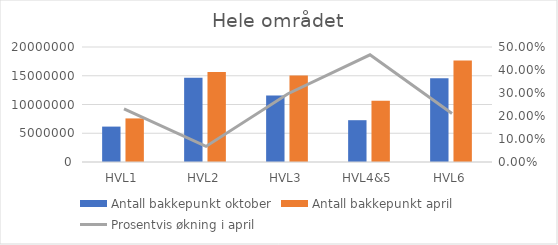
| Category | Antall bakkepunkt oktober | Antall bakkepunkt april |
|---|---|---|
| HVL1 | 6156679 | 7579050 |
| HVL2 | 14648623 | 15642803 |
| HVL3 | 11586794 | 15026966 |
| HVL4&5 | 7270626 | 10658437 |
| HVL6 | 14577638 | 17656011 |